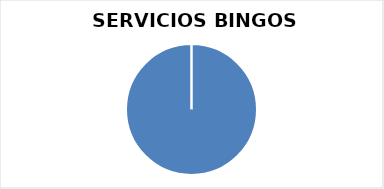
| Category | Series 0 |
|---|---|
| 0 | 217 |
| 1 | 0 |